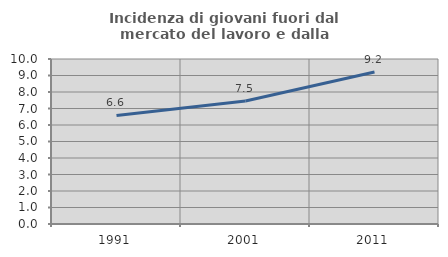
| Category | Incidenza di giovani fuori dal mercato del lavoro e dalla formazione  |
|---|---|
| 1991.0 | 6.581 |
| 2001.0 | 7.45 |
| 2011.0 | 9.208 |